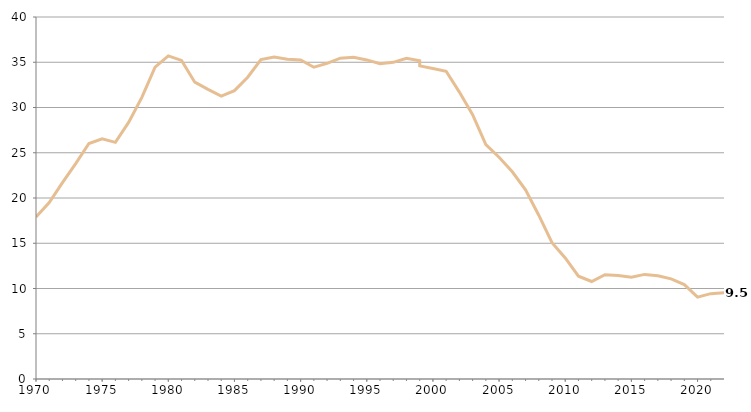
| Category | Series 0 |
|---|---|
| 1970.0 | 17.9 |
| 1971.0 | 19.5 |
| 1972.0 | 21.7 |
| 1973.0 | 23.8 |
| 1974.0 | 26.02 |
| 1975.0 | 26.55 |
| 1976.0 | 26.15 |
| 1977.0 | 28.35 |
| 1978.0 | 31.12 |
| 1979.0 | 34.45 |
| 1980.0 | 35.7 |
| 1981.0 | 35.2 |
| 1982.0 | 32.8 |
| 1983.0 | 32 |
| 1984.0 | 31.261 |
| 1985.0 | 31.865 |
| 1986.0 | 33.344 |
| 1987.0 | 35.303 |
| 1988.0 | 35.581 |
| 1989.0 | 35.34 |
| 1990.0 | 35.247 |
| 1991.0 | 34.453 |
| 1992.0 | 34.875 |
| 1993.0 | 35.446 |
| 1994.0 | 35.544 |
| 1995.0 | 35.258 |
| 1996.0 | 34.829 |
| 1997.0 | 34.99 |
| 1998.0 | 35.437 |
| 1999.0 | 35.169 |
| 1999.0 | 34.6 |
| 2000.0 | 34.3 |
| 2001.0 | 34 |
| 2002.0 | 31.7 |
| 2003.0 | 29.2 |
| 2004.0 | 25.9 |
| 2005.0 | 24.5 |
| 2006.0 | 22.9 |
| 2007.0 | 20.9 |
| 2008.0 | 18.1 |
| 2009.0 | 15.06 |
| 2010.0 | 13.378 |
| 2011.0 | 11.354 |
| 2012.0 | 10.773 |
| 2013.0 | 11.519 |
| 2014.0 | 11.441 |
| 2015.0 | 11.244 |
| 2016.0 | 11.559 |
| 2017.0 | 11.397 |
| 2018.0 | 11.068 |
| 2019.0 | 10.437 |
| 2020.0 | 9.051 |
| 2021.0 | 9.431 |
| 2022.0 | 9.518 |